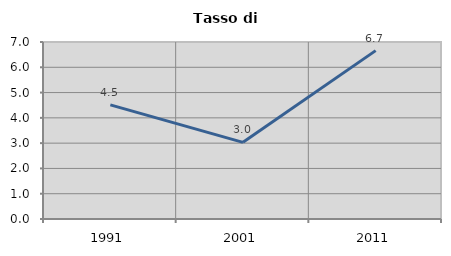
| Category | Tasso di disoccupazione   |
|---|---|
| 1991.0 | 4.514 |
| 2001.0 | 3.032 |
| 2011.0 | 6.659 |